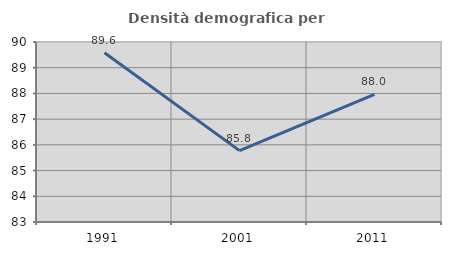
| Category | Densità demografica |
|---|---|
| 1991.0 | 89.581 |
| 2001.0 | 85.775 |
| 2011.0 | 87.967 |